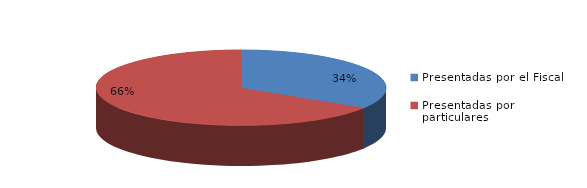
| Category | Series 0 |
|---|---|
| Presentadas por el Fiscal | 112 |
| Presentadas por particulares | 218 |